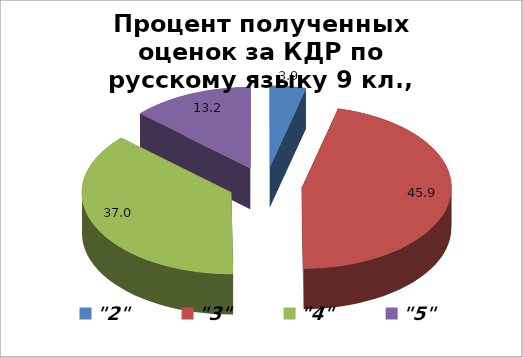
| Category | Series 0 |
|---|---|
| "2" | 3.887 |
| "3" | 45.936 |
| "4" | 36.985 |
| "5" | 13.192 |